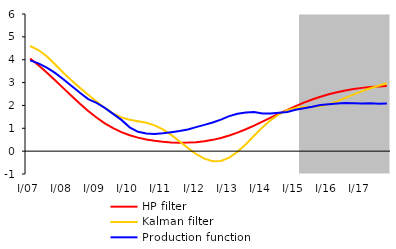
| Category | HP filter | Kalman filter | Production function |
|---|---|---|---|
| I/07 | 4.052 | 4.599 | 3.971 |
| II | 3.755 | 4.422 | 3.842 |
| III | 3.436 | 4.149 | 3.655 |
| IV | 3.1 | 3.802 | 3.423 |
| I/08 | 2.756 | 3.433 | 3.145 |
| II | 2.412 | 3.086 | 2.846 |
| III | 2.077 | 2.768 | 2.556 |
| IV | 1.759 | 2.471 | 2.276 |
| I/09 | 1.47 | 2.174 | 2.108 |
| II | 1.216 | 1.891 | 1.889 |
| III | 1.003 | 1.65 | 1.628 |
| IV | 0.83 | 1.475 | 1.367 |
| I/10 | 0.695 | 1.37 | 1.04 |
| II | 0.591 | 1.308 | 0.848 |
| III | 0.511 | 1.242 | 0.773 |
| IV | 0.452 | 1.13 | 0.753 |
| I/11 | 0.41 | 0.953 | 0.78 |
| II | 0.383 | 0.713 | 0.827 |
| III | 0.37 | 0.433 | 0.877 |
| IV | 0.373 | 0.142 | 0.948 |
| I/12 | 0.393 | -0.126 | 1.051 |
| II | 0.433 | -0.329 | 1.149 |
| III | 0.494 | -0.438 | 1.255 |
| IV | 0.578 | -0.427 | 1.38 |
| I/13 | 0.684 | -0.283 | 1.533 |
| II | 0.812 | -0.028 | 1.632 |
| III | 0.959 | 0.305 | 1.69 |
| IV | 1.119 | 0.676 | 1.709 |
| I/14 | 1.289 | 1.038 | 1.643 |
| II | 1.463 | 1.359 | 1.649 |
| III | 1.637 | 1.613 | 1.68 |
| IV | 1.807 | 1.791 | 1.714 |
| I/15 | 1.969 | 1.892 | 1.81 |
| II | 2.12 | 1.93 | 1.873 |
| III | 2.257 | 1.947 | 1.938 |
| IV | 2.38 | 1.979 | 2.017 |
| I/16 | 2.487 | 2.053 | 2.051 |
| II | 2.578 | 2.177 | 2.084 |
| III | 2.655 | 2.328 | 2.101 |
| IV | 2.718 | 2.482 | 2.094 |
| I/17 | 2.768 | 2.624 | 2.086 |
| II | 2.806 | 2.749 | 2.091 |
| III | 2.832 | 2.862 | 2.078 |
| IV | 2.85 | 2.969 | 2.088 |